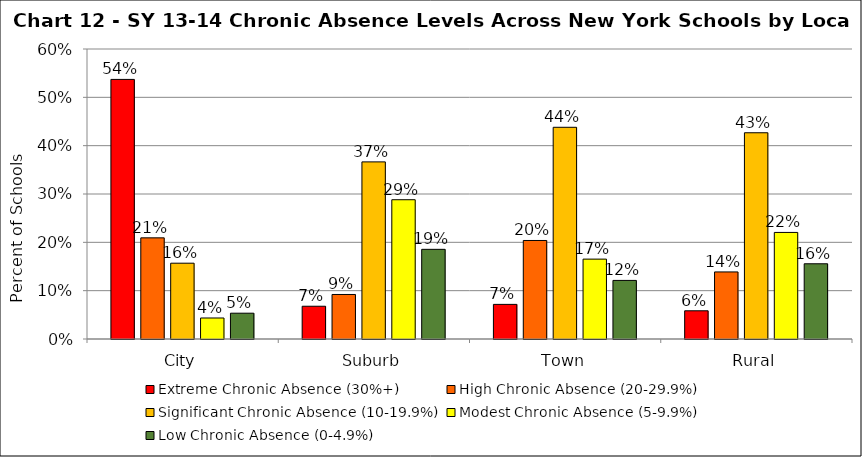
| Category | Extreme Chronic Absence (30%+) | High Chronic Absence (20-29.9%) | Significant Chronic Absence (10-19.9%) | Modest Chronic Absence (5-9.9%) | Low Chronic Absence (0-4.9%) |
|---|---|---|---|---|---|
| 0 | 0.537 | 0.209 | 0.157 | 0.043 | 0.053 |
| 1 | 0.068 | 0.092 | 0.366 | 0.288 | 0.186 |
| 2 | 0.072 | 0.204 | 0.438 | 0.165 | 0.121 |
| 3 | 0.058 | 0.139 | 0.427 | 0.22 | 0.156 |